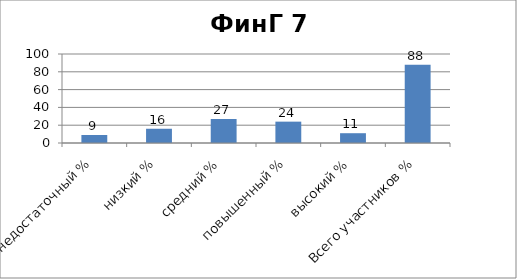
| Category | Series 0 |
|---|---|
| недостаточный % | 9 |
| низкий % | 16 |
| средний % | 27 |
| повышенный % | 24 |
| высокий % | 11 |
| Всего участников % | 88 |